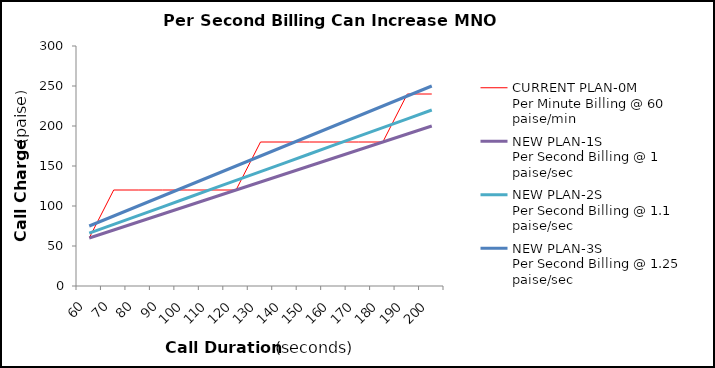
| Category | CURRENT PLAN-0M
Per Minute Billing @ 60 paise/min | NEW PLAN-1S
Per Second Billing @ 1 paise/sec | NEW PLAN-2S
Per Second Billing @ 1.1 paise/sec | NEW PLAN-3S
Per Second Billing @ 1.25 paise/sec |
|---|---|---|---|---|
| 60.0 | 60 | 60 | 66 | 75 |
| 70.0 | 120 | 70 | 77 | 87.5 |
| 80.0 | 120 | 80 | 88 | 100 |
| 90.0 | 120 | 90 | 99 | 112.5 |
| 100.0 | 120 | 100 | 110 | 125 |
| 110.0 | 120 | 110 | 121 | 137.5 |
| 120.0 | 120 | 120 | 132 | 150 |
| 130.0 | 180 | 130 | 143 | 162.5 |
| 140.0 | 180 | 140 | 154 | 175 |
| 150.0 | 180 | 150 | 165 | 187.5 |
| 160.0 | 180 | 160 | 176 | 200 |
| 170.0 | 180 | 170 | 187 | 212.5 |
| 180.0 | 180 | 180 | 198 | 225 |
| 190.0 | 240 | 190 | 209 | 237.5 |
| 200.0 | 240 | 200 | 220 | 250 |